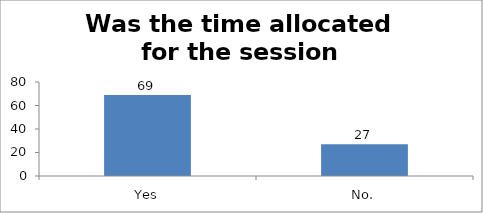
| Category | Was the time allocated for the session sufficient? |
|---|---|
| Yes | 69 |
| No. | 27 |